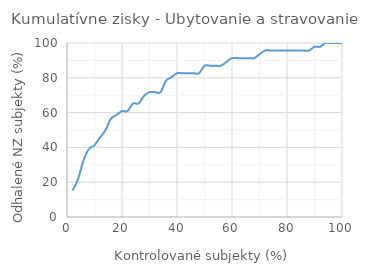
| Category | Ubytovanie a stravovanie |
|---|---|
| 2.0 | 15.217 |
| 4.0 | 21.739 |
| 6.0 | 32.609 |
| 8.0 | 39.13 |
| 10.0 | 41.304 |
| 12.0 | 45.652 |
| 14.0 | 50 |
| 16.0 | 56.522 |
| 18.0 | 58.696 |
| 20.0 | 60.87 |
| 22.0 | 60.87 |
| 24.0 | 65.217 |
| 26.0 | 65.217 |
| 28.0 | 69.565 |
| 30.0 | 71.739 |
| 32.0 | 71.739 |
| 34.0 | 71.739 |
| 36.0 | 78.261 |
| 38.0 | 80.435 |
| 40.0 | 82.609 |
| 42.0 | 82.609 |
| 44.0 | 82.609 |
| 46.0 | 82.609 |
| 48.0 | 82.609 |
| 50.0 | 86.957 |
| 52.0 | 86.957 |
| 54.0 | 86.957 |
| 56.0 | 86.957 |
| 58.0 | 89.13 |
| 60.0 | 91.304 |
| 62.0 | 91.304 |
| 64.0 | 91.304 |
| 66.0 | 91.304 |
| 68.0 | 91.304 |
| 70.0 | 93.478 |
| 72.0 | 95.652 |
| 74.0 | 95.652 |
| 76.0 | 95.652 |
| 78.0 | 95.652 |
| 80.0 | 95.652 |
| 82.0 | 95.652 |
| 84.0 | 95.652 |
| 86.0 | 95.652 |
| 88.0 | 95.652 |
| 90.0 | 97.826 |
| 92.0 | 97.826 |
| 94.0 | 100 |
| 96.0 | 100 |
| 98.0 | 100 |
| 100.0 | 100 |